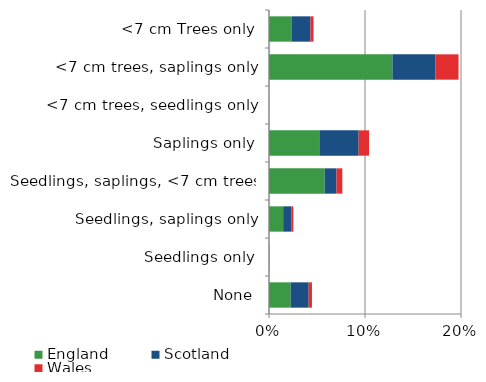
| Category | England | Scotland | Wales |
|---|---|---|---|
| None | 0.023 | 0.019 | 0.003 |
| Seedlings only | 0 | 0 | 0 |
| Seedlings, saplings only | 0.015 | 0.009 | 0.002 |
| Seedlings, saplings, <7 cm trees | 0.058 | 0.012 | 0.006 |
| Saplings only | 0.052 | 0.041 | 0.011 |
| <7 cm trees, seedlings only | 0 | 0 | 0 |
| <7 cm trees, saplings only | 0.129 | 0.045 | 0.024 |
| <7 cm Trees only | 0.024 | 0.019 | 0.003 |